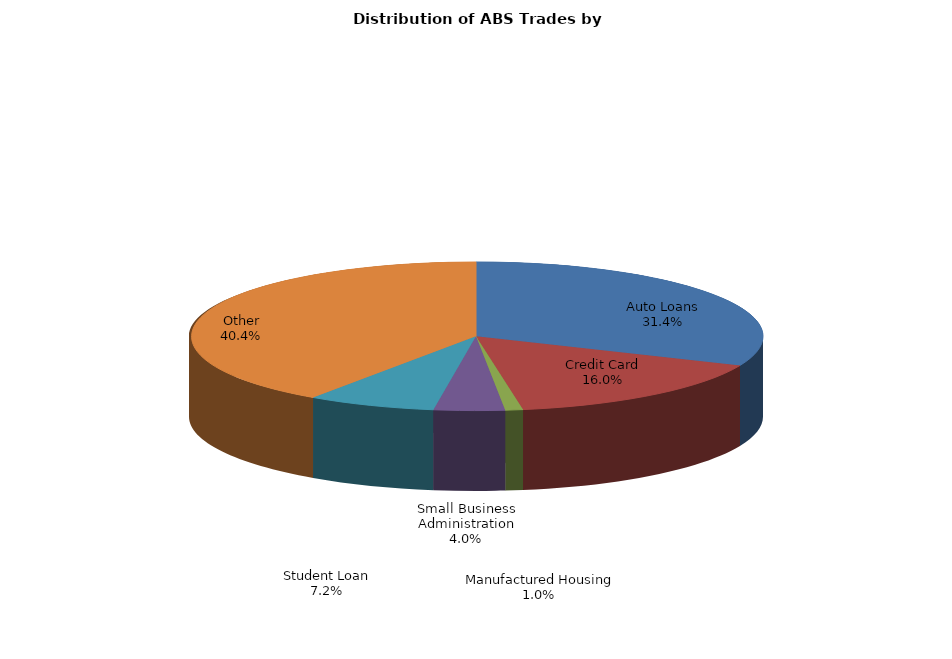
| Category | Series 0 |
|---|---|
| Auto Loans | 126 |
| Credit Card | 64 |
| Manufactured Housing | 4 |
| Small Business Administration | 16 |
| Student Loan | 29 |
| Other | 162 |